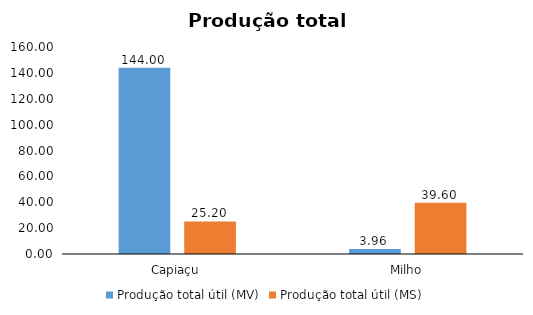
| Category | Produção total útil (MV) | Produção total útil (MS) |
|---|---|---|
| Capiaçu | 144 | 25.2 |
| Milho | 3.96 | 39.6 |